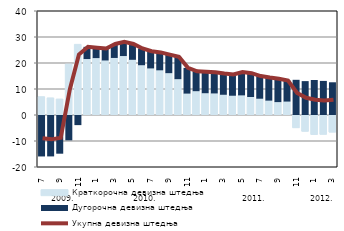
| Category | Краткорочна девизна штедња | Дугорочна девизна штедња |
|---|---|---|
| 0 | 7.031 | -15.944 |
| 1900-01-01 | 6.564 | -15.928 |
| 1900-01-02 | 6.128 | -14.882 |
| 1900-01-03 | 19.57 | -9.748 |
| 1900-01-04 | 27.161 | -3.892 |
| 1900-01-05 | 21.524 | 4.699 |
| 1900-01-06 | 21.886 | 3.984 |
| 1900-01-07 | 20.973 | 4.608 |
| 1900-01-08 | 21.941 | 5.376 |
| 1900-01-09 | 22.678 | 5.497 |
| 1900-01-10 | 21.224 | 6.105 |
| 1900-01-11 | 19.144 | 6.431 |
| 1900-01-12 | 17.918 | 6.632 |
| 1900-01-13 | 17.19 | 6.883 |
| 1900-01-14 | 16.093 | 7.122 |
| 1900-01-15 | 13.783 | 8.587 |
| 1900-01-16 | 8.233 | 9.891 |
| 1900-01-17 | 9.16 | 7.62 |
| 1900-01-18 | 8.377 | 8.274 |
| 1900-01-19 | 8.297 | 8.109 |
| 1900-01-20 | 7.78 | 8.167 |
| 1900-01-21 | 7.41 | 8.213 |
| 1900-01-22 | 7.546 | 9.002 |
| 1900-01-23 | 6.926 | 9.155 |
| 1900-01-24 | 6.262 | 8.715 |
| 1900-01-25 | 5.529 | 8.869 |
| 1900-01-26 | 4.962 | 8.984 |
| 1900-01-27 | 5.164 | 8.1 |
| 1900-01-28 | -5.034 | 13.536 |
| 1900-01-29 | -6.394 | 13.032 |
| 1900-01-30 | -7.622 | 13.468 |
| 1900-01-31 | -7.559 | 13.11 |
| 1900-02-01 | -6.718 | 12.585 |